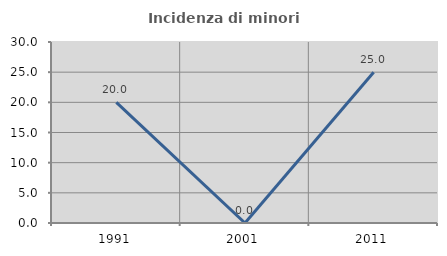
| Category | Incidenza di minori stranieri |
|---|---|
| 1991.0 | 20 |
| 2001.0 | 0 |
| 2011.0 | 25 |